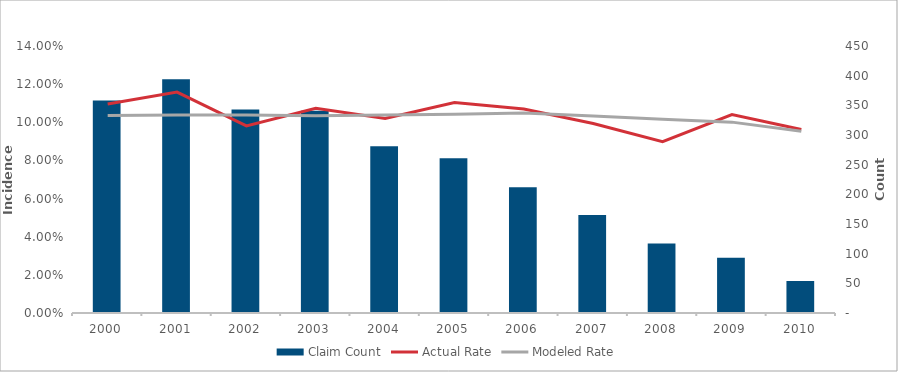
| Category | Claim Count |
|---|---|
| 2000.0 | 358 |
| 2001.0 | 394 |
| 2002.0 | 343 |
| 2003.0 | 341 |
| 2004.0 | 281 |
| 2005.0 | 261 |
| 2006.0 | 212 |
| 2007.0 | 165 |
| 2008.0 | 117 |
| 2009.0 | 93 |
| 2010.0 | 54 |